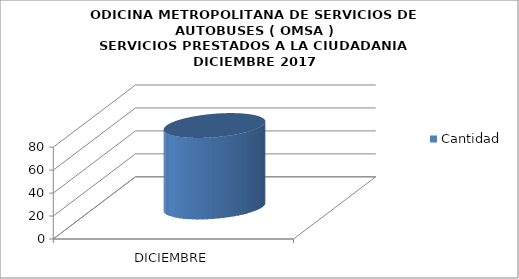
| Category | Cantidad |
|---|---|
| DICIEMBRE | 71 |